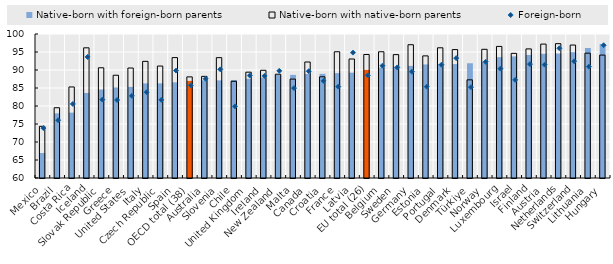
| Category | Native-born with foreign-born parents | Native-born with native-born parents |
|---|---|---|
| Mexico | 66.946 | 74.357 |
| Brazil | 77.965 | 79.518 |
| Costa Rica | 78.154 | 85.29 |
| Iceland | 83.604 | 96.16 |
| Slovak Republic | 84.583 | 90.615 |
| Greece | 85.151 | 88.546 |
| United States | 85.295 | 90.548 |
| Italy | 86.283 | 92.401 |
| Czech Republic | 86.294 | 91.097 |
| Spain | 86.576 | 93.444 |
| OECD total (38) | 86.977 | 88.088 |
| Australia | 87.129 | 88.229 |
| Slovenia | 87.131 | 93.43 |
| Chile | 87.232 | 86.865 |
| United Kingdom | 87.562 | 89.398 |
| Ireland | 87.872 | 89.92 |
| New Zealand | 88.608 | 88.827 |
| Malta | 88.642 | 87.477 |
| Canada | 88.898 | 92.223 |
| Croatia | 88.925 | 88.117 |
| France | 89.121 | 95.068 |
| Latvia | 89.254 | 93.056 |
| EU total (26) | 90.033 | 94.312 |
| Belgium | 90.669 | 95.067 |
| Sweden | 90.902 | 94.275 |
| Germany | 91.142 | 97.021 |
| Estonia | 91.541 | 93.92 |
| Portugal | 91.646 | 96.165 |
| Denmark | 91.649 | 95.671 |
| Türkiye | 91.873 | 87.266 |
| Norway | 92.276 | 95.747 |
| Luxembourg | 93.572 | 96.552 |
| Israel | 93.766 | 94.624 |
| Finland | 94.173 | 95.861 |
| Austria | 94.499 | 97.2 |
| Netherlands | 94.572 | 97.314 |
| Switzerland | 94.943 | 96.928 |
| Lithuania | 96.129 | 94.678 |
| Hungary | 97.221 | 94.144 |